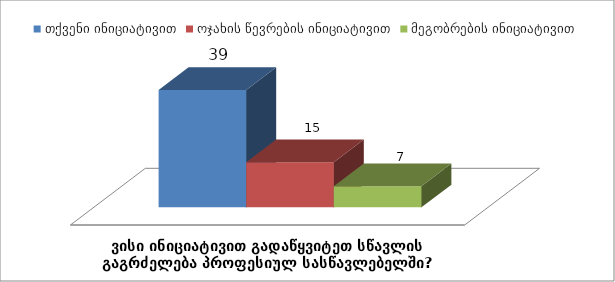
| Category | თქვენი ინიციატივით | ოჯახის წევრების ინიციატივით | მეგობრების ინიციატივით |
|---|---|---|---|
| ვისი ინიციატივით გადაწყვიტეთ სწავლის გაგრძელება პროფესიულ სასწავლებელში? | 39 | 15 | 7 |